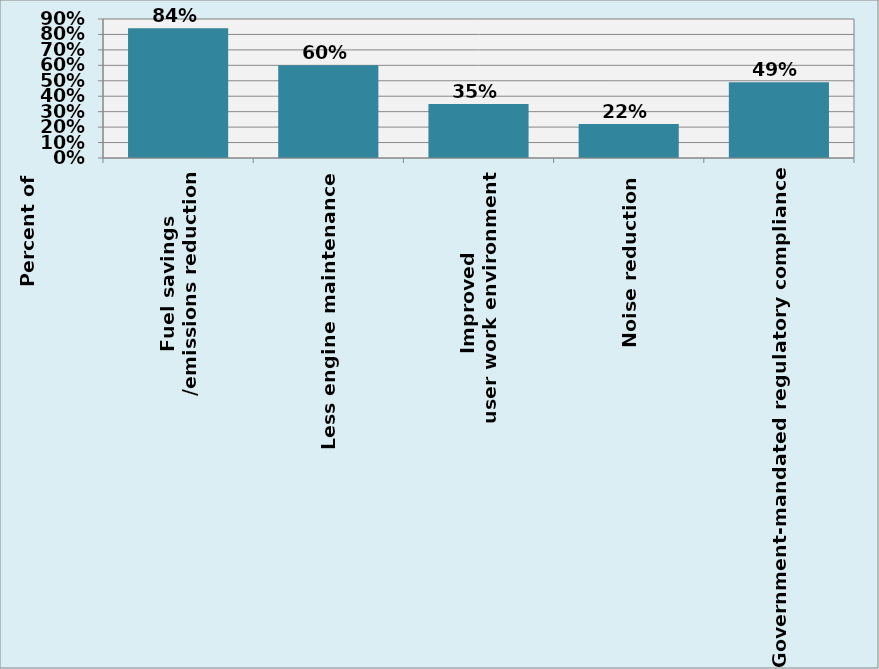
| Category | Series 0 |
|---|---|
| Fuel savings
/emissions reduction | 0.84 |
| Less engine maintenance | 0.6 |
| Improved 
user work environment | 0.35 |
| Noise reduction | 0.22 |
| Government-mandated regulatory compliance | 0.49 |